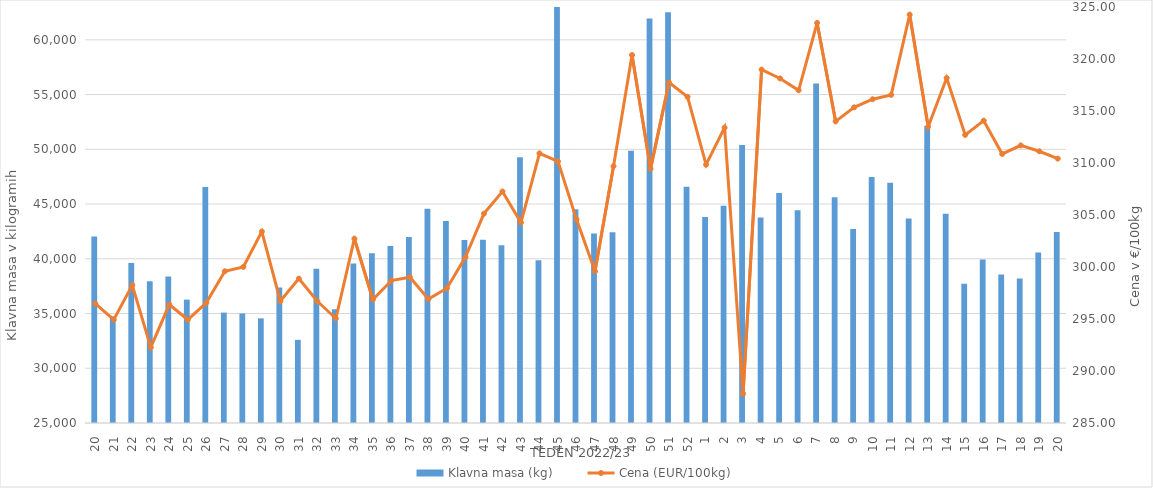
| Category | Klavna masa (kg) |
|---|---|
| 20.0 | 42047 |
| 21.0 | 34739 |
| 22.0 | 39626 |
| 23.0 | 37939 |
| 24.0 | 38390 |
| 25.0 | 36272 |
| 26.0 | 46553 |
| 27.0 | 35085 |
| 28.0 | 35007 |
| 29.0 | 34559 |
| 30.0 | 37366 |
| 31.0 | 32599 |
| 32.0 | 39100 |
| 33.0 | 35388 |
| 34.0 | 39563 |
| 35.0 | 40507 |
| 36.0 | 41176 |
| 37.0 | 41983 |
| 38.0 | 44572 |
| 39.0 | 43447 |
| 40.0 | 41711 |
| 41.0 | 41736 |
| 42.0 | 41239 |
| 43.0 | 49284 |
| 44.0 | 39877 |
| 45.0 | 63668 |
| 46.0 | 44528 |
| 47.0 | 42319 |
| 48.0 | 42416 |
| 49.0 | 49873 |
| 50.0 | 61942 |
| 51.0 | 62514 |
| 52.0 | 46589 |
| 1.0 | 43807 |
| 2.0 | 44834 |
| 3.0 | 50386 |
| 4.0 | 43773 |
| 5.0 | 46011 |
| 6.0 | 44439 |
| 7.0 | 56001 |
| 8.0 | 45613 |
| 9.0 | 42730 |
| 10.0 | 47471 |
| 11.0 | 46952 |
| 12.0 | 43683 |
| 13.0 | 52135 |
| 14.0 | 44103 |
| 15.0 | 37719 |
| 16.0 | 39943 |
| 17.0 | 38574 |
| 18.0 | 38200 |
| 19.0 | 40581 |
| 20.0 | 42443 |